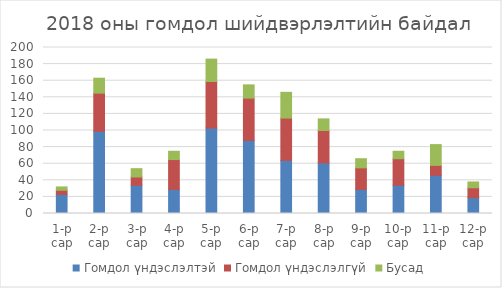
| Category | Гомдол үндэслэлтэй | Гомдол үндэслэлгүй | Бусад |
|---|---|---|---|
| 1-р сар | 23 | 5 | 4 |
| 2-р сар | 99 | 46 | 18 |
| 3-р сар | 34 | 10 | 10 |
| 4-р сар | 29 | 36 | 10 |
| 5-р сар | 103 | 56 | 27 |
| 6-р сар | 88 | 51 | 16 |
| 7-р сар | 64 | 51 | 31 |
| 8-р сар | 61 | 39 | 14 |
| 9-р сар | 29 | 26 | 11 |
| 10-р сар | 34 | 32 | 9 |
| 11-р сар | 46 | 12 | 25 |
| 12-р сар | 19 | 12 | 7 |